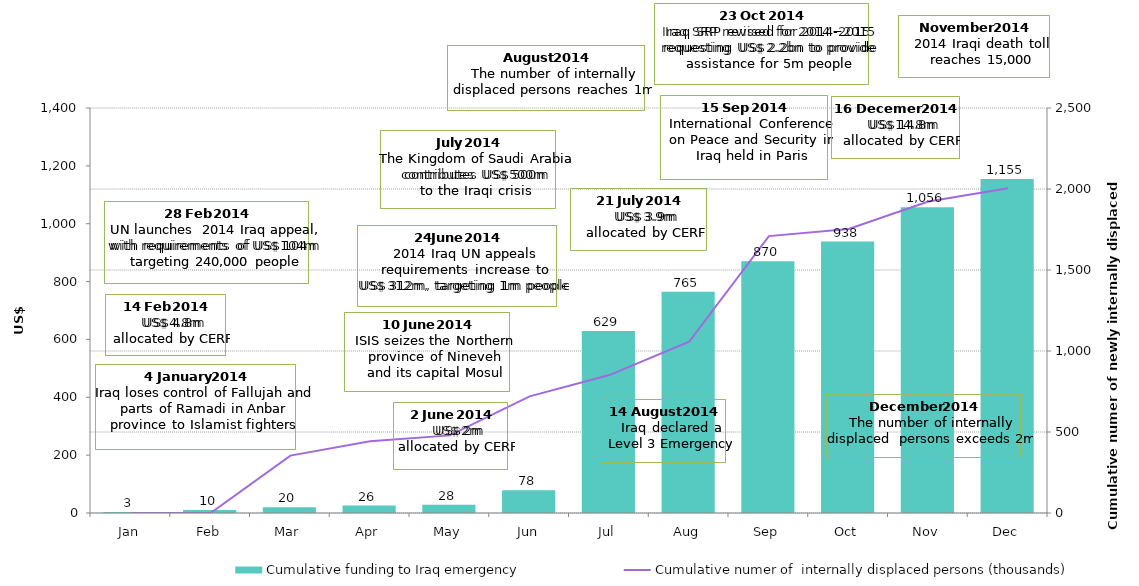
| Category | Cumulative funding to Iraq emergency |
|---|---|
| Jan | 3.406 |
| Feb | 10.14 |
| Mar | 19.779 |
| Apr | 25.886 |
| May | 28.318 |
| Jun | 78.474 |
| Jul | 629.085 |
| Aug | 765.169 |
| Sep | 870.269 |
| Oct | 938.296 |
| Nov | 1056.491 |
| Dec | 1154.564 |